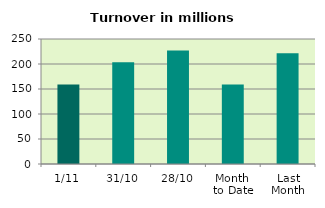
| Category | Series 0 |
|---|---|
| 1/11 | 158.934 |
| 31/10 | 203.739 |
| 28/10 | 227.15 |
| Month 
to Date | 158.934 |
| Last
Month | 221.516 |